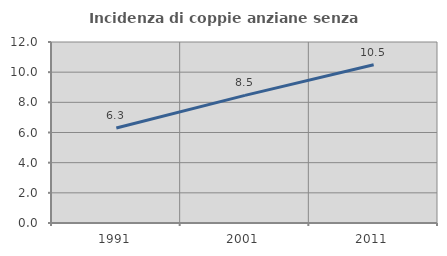
| Category | Incidenza di coppie anziane senza figli  |
|---|---|
| 1991.0 | 6.298 |
| 2001.0 | 8.461 |
| 2011.0 | 10.488 |